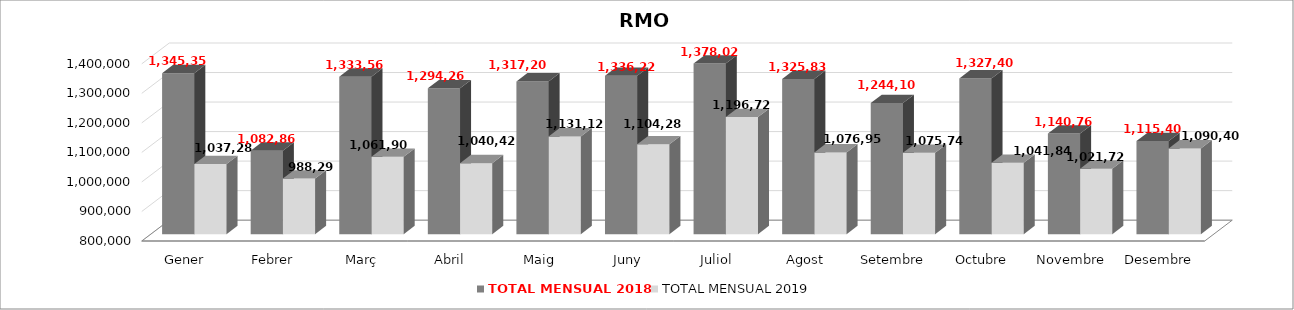
| Category | TOTAL MENSUAL 2018 | TOTAL MENSUAL 2019 |
|---|---|---|
| Gener | 1345359 | 1037280.01 |
| Febrer | 1082860 | 988299 |
| Març | 1333560 | 1061900 |
| Abril | 1294260 | 1040420 |
| Maig | 1317200 | 1131120 |
| Juny | 1336220 | 1104280 |
| Juliol | 1378020 | 1196720 |
| Agost | 1325839 | 1076958.82 |
| Setembre | 1244100 | 1075740 |
| Octubre | 1327400 | 1041840 |
| Novembre | 1140760 | 1021720 |
| Desembre | 1115400 | 1090399.99 |